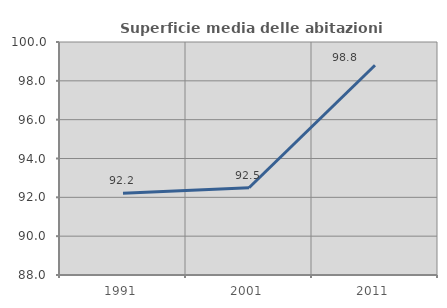
| Category | Superficie media delle abitazioni occupate |
|---|---|
| 1991.0 | 92.21 |
| 2001.0 | 92.493 |
| 2011.0 | 98.804 |